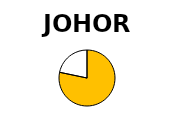
| Category | Series 1 | Series 0 |
|---|---|---|
| Operational Capacity (MW) | 54 | 33.996 |
| In progress (MW) | 14.99 | 0 |